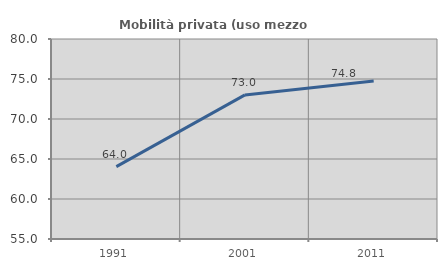
| Category | Mobilità privata (uso mezzo privato) |
|---|---|
| 1991.0 | 64.042 |
| 2001.0 | 73.01 |
| 2011.0 | 74.753 |